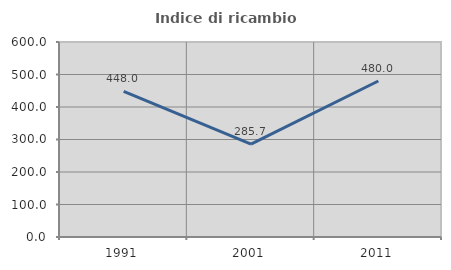
| Category | Indice di ricambio occupazionale  |
|---|---|
| 1991.0 | 448 |
| 2001.0 | 285.714 |
| 2011.0 | 480 |